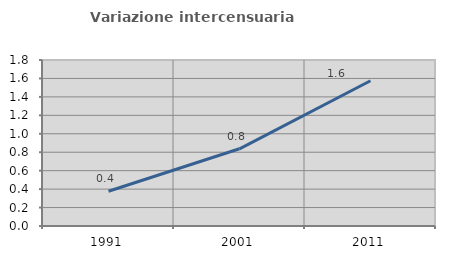
| Category | Variazione intercensuaria annua |
|---|---|
| 1991.0 | 0.377 |
| 2001.0 | 0.837 |
| 2011.0 | 1.575 |